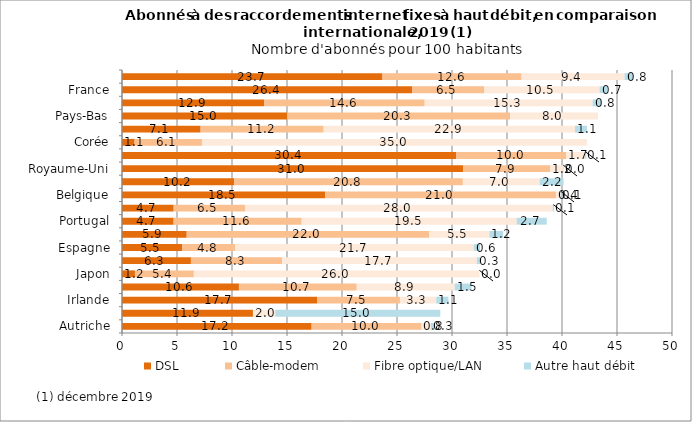
| Category | DSL  | Câble-modem | Fibre optique/LAN | Autre haut débit  |
|---|---|---|---|---|
| Autriche | 17.241 | 9.985 | 0.848 | 0.32 |
| Italie | 11.905 | 0 | 2.031 | 15 |
| Irlande | 17.728 | 7.54 | 3.295 | 1.121 |
| OCDE | 10.629 | 10.711 | 8.907 | 1.521 |
| Japon | 1.176 | 5.355 | 25.959 | 0.003 |
| Finlande | 6.266 | 8.295 | 17.694 | 0.29 |
| Espagne | 5.487 | 4.798 | 21.711 | 0.56 |
| États-Unis | 5.884 | 22.035 | 5.483 | 1.247 |
| Portugal | 4.696 | 11.636 | 19.542 | 2.737 |
| Suède | 4.696 | 6.484 | 27.971 | 0.14 |
| Belgique | 18.488 | 20.957 | 0.417 | 0.113 |
| Canada | 10.214 | 20.772 | 6.98 | 2.175 |
| Royaume-Uni | 31.031 | 7.895 | 1.173 | 0.042 |
| Allemagne | 30.398 | 9.996 | 1.719 | 0.099 |
| Corée | 1.148 | 6.12 | 34.994 | 0 |
| Norvège | 7.147 | 11.183 | 22.853 | 1.088 |
| Pays-Bas | 15.021 | 20.26 | 7.994 | 0 |
| Danemark | 12.941 | 14.577 | 15.264 | 0.809 |
| France | 26.398 | 6.548 | 10.469 | 0.704 |
| Suisse | 23.683 | 12.644 | 9.36 | 0.777 |